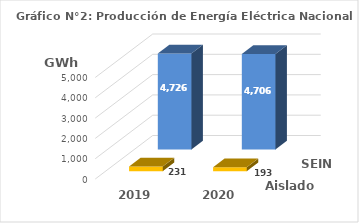
| Category | Aislados | SEIN |
|---|---|---|
| 2019.0 | 230.822 | 4726.428 |
| 2020.0 | 192.792 | 4706.424 |